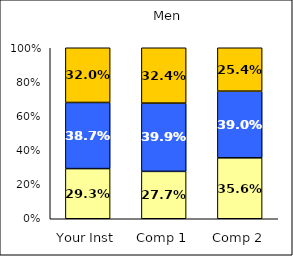
| Category | Low Civic Minded Practice | Average Civic Minded Practice | High Civic Minded Practice |
|---|---|---|---|
| Your Inst | 0.293 | 0.387 | 0.32 |
| Comp 1 | 0.277 | 0.399 | 0.324 |
| Comp 2 | 0.356 | 0.39 | 0.254 |